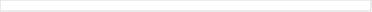
| Category | Korporasi Ritel Mikro KPR Non
KPR |
|---|---|
| 0 | 8.633 |
| 1 | 9.615 |
| 2 | 11.661 |
| 3 | 9.236 |
| 4 | 10.247 |